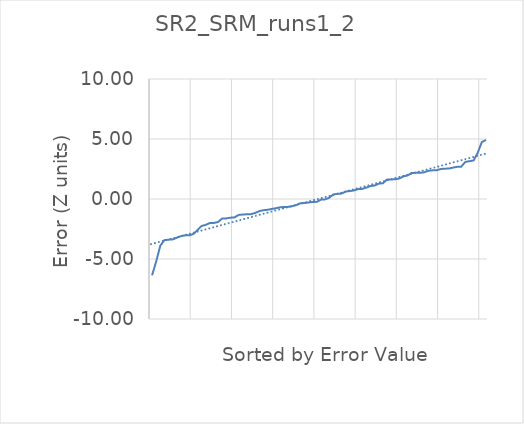
| Category | SR2_SRM_runs1_2 |
|---|---|
| 1.0 | -6.361 |
| 2.0 | -5.204 |
| 3.0 | -3.891 |
| 4.0 | -3.428 |
| 5.0 | -3.389 |
| 6.0 | -3.374 |
| 7.0 | -3.227 |
| 8.0 | -3.098 |
| 9.0 | -3.027 |
| 10.0 | -3.025 |
| 11.0 | -2.925 |
| 12.0 | -2.601 |
| 13.0 | -2.245 |
| 14.0 | -2.16 |
| 15.0 | -2.001 |
| 16.0 | -1.995 |
| 17.0 | -1.919 |
| 18.0 | -1.627 |
| 19.0 | -1.616 |
| 20.0 | -1.556 |
| 21.0 | -1.533 |
| 22.0 | -1.33 |
| 23.0 | -1.29 |
| 24.0 | -1.277 |
| 25.0 | -1.262 |
| 26.0 | -1.169 |
| 27.0 | -1.013 |
| 28.0 | -0.936 |
| 29.0 | -0.903 |
| 30.0 | -0.831 |
| 31.0 | -0.774 |
| 32.0 | -0.696 |
| 33.0 | -0.661 |
| 34.0 | -0.657 |
| 35.0 | -0.601 |
| 36.0 | -0.501 |
| 37.0 | -0.352 |
| 38.0 | -0.336 |
| 39.0 | -0.289 |
| 40.0 | -0.245 |
| 41.0 | -0.237 |
| 42.0 | -0.05 |
| 43.0 | -0.03 |
| 44.0 | 0.11 |
| 45.0 | 0.381 |
| 46.0 | 0.434 |
| 47.0 | 0.45 |
| 48.0 | 0.625 |
| 49.0 | 0.661 |
| 50.0 | 0.716 |
| 51.0 | 0.823 |
| 52.0 | 0.841 |
| 53.0 | 0.952 |
| 54.0 | 1.081 |
| 55.0 | 1.122 |
| 56.0 | 1.279 |
| 57.0 | 1.314 |
| 58.0 | 1.615 |
| 59.0 | 1.628 |
| 60.0 | 1.647 |
| 61.0 | 1.715 |
| 62.0 | 1.887 |
| 63.0 | 1.961 |
| 64.0 | 2.174 |
| 65.0 | 2.179 |
| 66.0 | 2.185 |
| 67.0 | 2.221 |
| 68.0 | 2.351 |
| 69.0 | 2.387 |
| 70.0 | 2.391 |
| 71.0 | 2.497 |
| 72.0 | 2.526 |
| 73.0 | 2.539 |
| 74.0 | 2.614 |
| 75.0 | 2.679 |
| 76.0 | 2.693 |
| 77.0 | 3.09 |
| 78.0 | 3.152 |
| 79.0 | 3.209 |
| 80.0 | 3.85 |
| 81.0 | 4.74 |
| 82.0 | 4.921 |